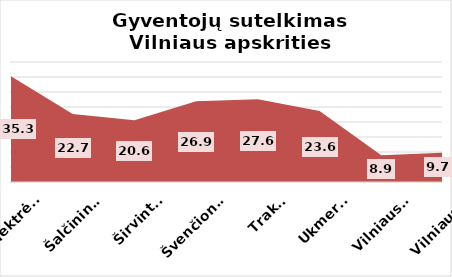
| Category | Series 0 |
|---|---|
| Elektrėnai | 35.28 |
| Šalčininkai | 22.7 |
| Širvintos | 20.55 |
| Švenčionys | 26.88 |
| Trakai | 27.59 |
| Ukmergė | 23.64 |
| Vilniaus r. | 8.93 |
| Vilniaus m. | 9.74 |